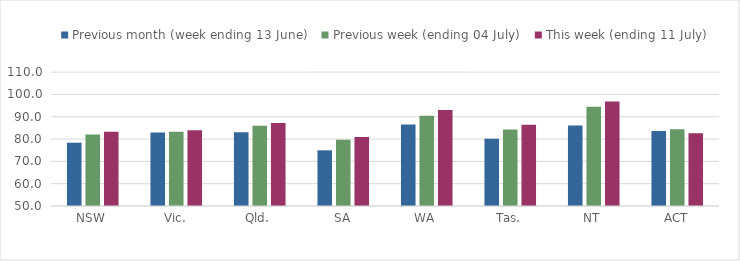
| Category | Previous month (week ending 13 June) | Previous week (ending 04 July) | This week (ending 11 July) |
|---|---|---|---|
| NSW | 78.375 | 82.014 | 83.251 |
| Vic. | 82.909 | 83.267 | 83.984 |
| Qld. | 83.051 | 85.996 | 87.195 |
| SA | 74.963 | 79.652 | 80.899 |
| WA | 86.577 | 90.439 | 92.995 |
| Tas. | 80.148 | 84.306 | 86.402 |
| NT | 86.111 | 94.547 | 96.858 |
| ACT | 83.615 | 84.395 | 82.568 |